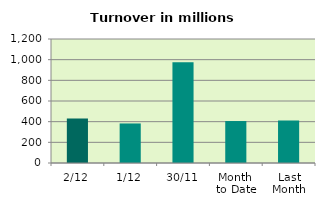
| Category | Series 0 |
|---|---|
| 2/12 | 429.466 |
| 1/12 | 382.696 |
| 30/11 | 974.069 |
| Month 
to Date | 406.081 |
| Last
Month | 410.338 |